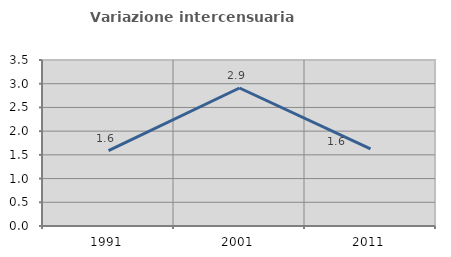
| Category | Variazione intercensuaria annua |
|---|---|
| 1991.0 | 1.59 |
| 2001.0 | 2.91 |
| 2011.0 | 1.625 |